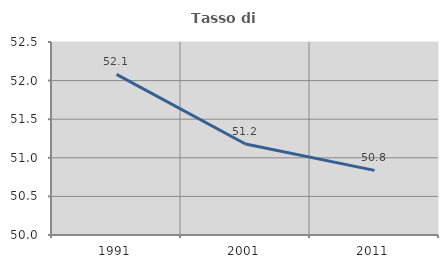
| Category | Tasso di occupazione   |
|---|---|
| 1991.0 | 52.081 |
| 2001.0 | 51.178 |
| 2011.0 | 50.837 |